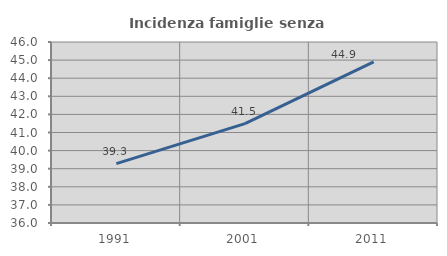
| Category | Incidenza famiglie senza nuclei |
|---|---|
| 1991.0 | 39.279 |
| 2001.0 | 41.489 |
| 2011.0 | 44.898 |